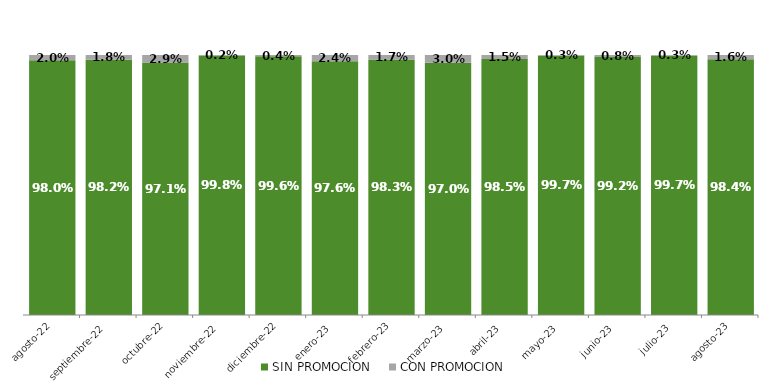
| Category | SIN PROMOCION   | CON PROMOCION   |
|---|---|---|
| 2022-08-01 | 0.98 | 0.02 |
| 2022-09-01 | 0.982 | 0.018 |
| 2022-10-01 | 0.971 | 0.029 |
| 2022-11-01 | 0.998 | 0.002 |
| 2022-12-01 | 0.996 | 0.004 |
| 2023-01-01 | 0.976 | 0.024 |
| 2023-02-01 | 0.983 | 0.017 |
| 2023-03-01 | 0.97 | 0.03 |
| 2023-04-01 | 0.985 | 0.015 |
| 2023-05-01 | 0.997 | 0.003 |
| 2023-06-01 | 0.992 | 0.008 |
| 2023-07-01 | 0.997 | 0.003 |
| 2023-08-01 | 0.984 | 0.016 |